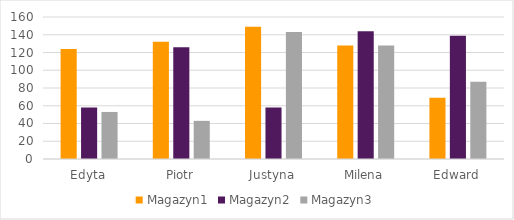
| Category | Magazyn1 | Magazyn2 | Magazyn3 |
|---|---|---|---|
| Edyta | 124 | 58 | 53 |
| Piotr | 132 | 126 | 43 |
| Justyna | 149 | 58 | 143 |
| Milena | 128 | 144 | 128 |
| Edward | 69 | 139 | 87 |